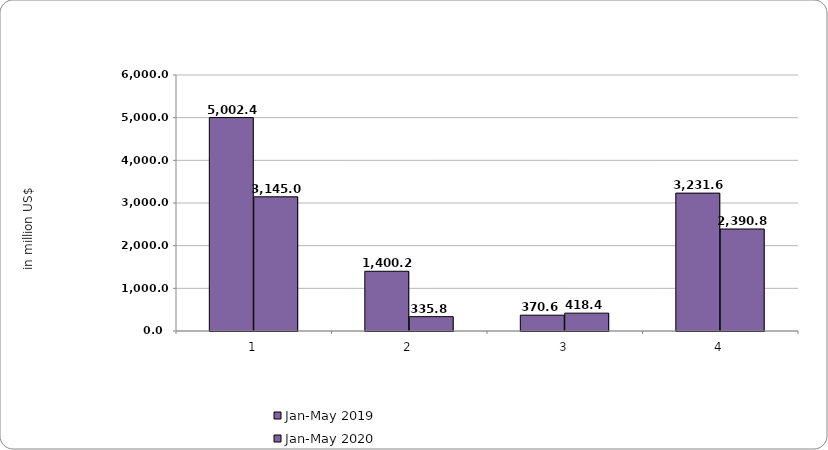
| Category | Jan-May 2019 | Jan-May 2020 |
|---|---|---|
| 0 | 5002.42 | 3145.029 |
| 1 | 1400.167 | 335.829 |
| 2 | 370.612 | 418.431 |
| 3 | 3231.64 | 2390.769 |